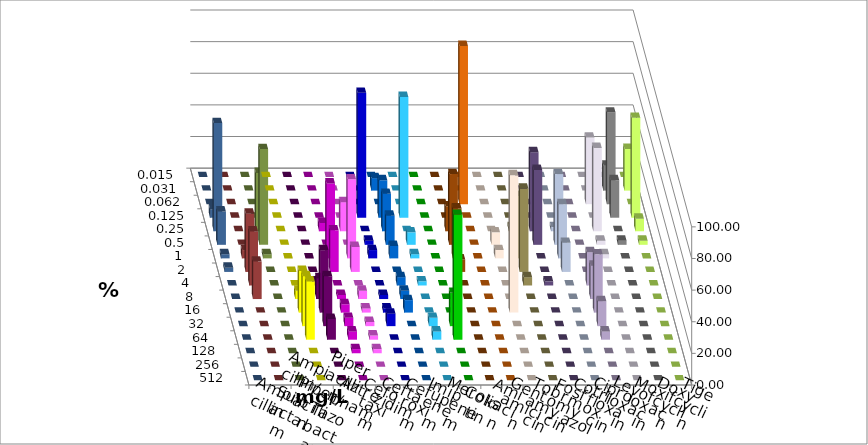
| Category | Ampicillin | Ampicillin/ Sulbactam | Piperacillin | Piperacillin/ Tazobactam | Aztreonam | Cefotaxim | Ceftazidim | Cefuroxim | Imipenem | Meropenem | Colistin | Amikacin | Gentamicin | Tobramycin | Fosfomycin | Cotrimoxazol | Ciprofloxacin | Levofloxacin | Moxifloxacin | Doxycyclin | Tigecyclin |
|---|---|---|---|---|---|---|---|---|---|---|---|---|---|---|---|---|---|---|---|---|---|
| 0.015 | 0 | 0 | 0 | 0 | 0 | 0 | 0 | 0 | 0 | 0 | 0 | 0 | 0 | 0 | 0 | 0 | 0 | 0 | 0 | 0 | 0 |
| 0.031 | 0 | 0 | 0 | 0 | 0 | 7.895 | 0 | 0 | 0 | 0 | 0 | 0 | 0 | 0 | 0 | 0 | 15.789 | 26.316 | 0 | 0 | 0 |
| 0.062 | 0 | 0 | 0 | 0 | 0 | 0 | 0 | 0 | 0 | 100 | 0 | 0 | 0 | 0 | 0 | 42.105 | 57.895 | 0 | 0 | 0 | 0 |
| 0.125 | 0 | 0 | 0 | 0 | 78.947 | 23.684 | 76.316 | 0 | 0 | 0 | 0 | 0 | 0 | 0 | 0 | 0 | 23.684 | 63.158 | 5.263 | 0 | 0 |
| 0.25 | 0 | 0 | 5.263 | 18.421 | 0 | 23.684 | 0 | 0 | 15.789 | 0 | 0 | 2.632 | 50 | 2.632 | 0 | 52.632 | 0 | 7.895 | 68.421 | 0 | 36.842 |
| 0.5 | 0 | 0 | 0 | 0 | 2.632 | 18.421 | 7.895 | 0 | 44.737 | 0 | 7.895 | 0 | 47.368 | 44.737 | 0 | 2.632 | 2.632 | 2.632 | 21.053 | 0 | 60.526 |
| 1.0 | 0 | 0 | 47.368 | 50 | 5.263 | 7.895 | 2.632 | 0 | 31.579 | 0 | 5.263 | 39.474 | 0 | 34.211 | 0 | 2.632 | 0 | 0 | 2.632 | 5.263 | 2.632 |
| 2.0 | 0 | 0 | 26.316 | 15.789 | 0 | 0 | 0 | 0 | 7.895 | 0 | 0 | 52.632 | 0 | 18.421 | 0 | 0 | 0 | 0 | 2.632 | 36.842 | 0 |
| 4.0 | 0 | 2.632 | 0 | 0 | 0 | 5.263 | 2.632 | 0 | 0 | 0 | 0 | 5.263 | 2.632 | 0 | 21.053 | 0 | 0 | 0 | 0 | 34.211 | 0 |
| 8.0 | 5.263 | 13.158 | 2.632 | 5.263 | 2.632 | 5.263 | 0 | 0 | 0 | 0 | 0 | 0 | 0 | 0 | 21.053 | 0 | 0 | 0 | 0 | 23.684 | 0 |
| 16.0 | 26.316 | 39.474 | 5.263 | 2.632 | 2.632 | 7.895 | 0 | 0 | 0 | 0 | 86.842 | 0 | 0 | 0 | 36.842 | 0 | 0 | 0 | 0 | 0 | 0 |
| 32.0 | 31.579 | 31.579 | 5.263 | 2.632 | 7.895 | 0 | 5.263 | 21.053 | 0 | 0 | 0 | 0 | 0 | 0 | 15.789 | 0 | 0 | 0 | 0 | 0 | 0 |
| 64.0 | 36.842 | 13.158 | 5.263 | 2.632 | 0 | 0 | 5.263 | 78.947 | 0 | 0 | 0 | 0 | 0 | 0 | 5.263 | 0 | 0 | 0 | 0 | 0 | 0 |
| 128.0 | 0 | 0 | 2.632 | 2.632 | 0 | 0 | 0 | 0 | 0 | 0 | 0 | 0 | 0 | 0 | 0 | 0 | 0 | 0 | 0 | 0 | 0 |
| 256.0 | 0 | 0 | 0 | 0 | 0 | 0 | 0 | 0 | 0 | 0 | 0 | 0 | 0 | 0 | 0 | 0 | 0 | 0 | 0 | 0 | 0 |
| 512.0 | 0 | 0 | 0 | 0 | 0 | 0 | 0 | 0 | 0 | 0 | 0 | 0 | 0 | 0 | 0 | 0 | 0 | 0 | 0 | 0 | 0 |